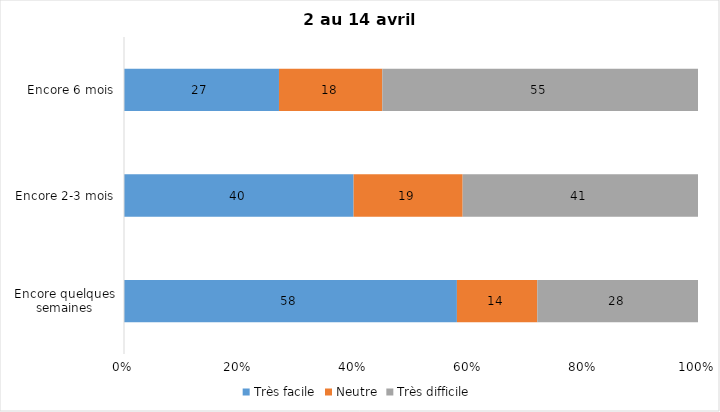
| Category | Très facile | Neutre | Très difficile |
|---|---|---|---|
| Encore quelques semaines | 58 | 14 | 28 |
| Encore 2-3 mois | 40 | 19 | 41 |
| Encore 6 mois | 27 | 18 | 55 |